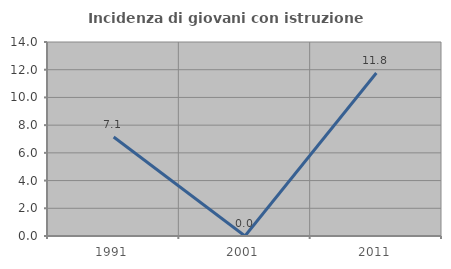
| Category | Incidenza di giovani con istruzione universitaria |
|---|---|
| 1991.0 | 7.143 |
| 2001.0 | 0 |
| 2011.0 | 11.765 |